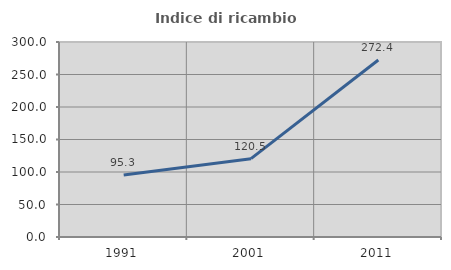
| Category | Indice di ricambio occupazionale  |
|---|---|
| 1991.0 | 95.292 |
| 2001.0 | 120.541 |
| 2011.0 | 272.394 |